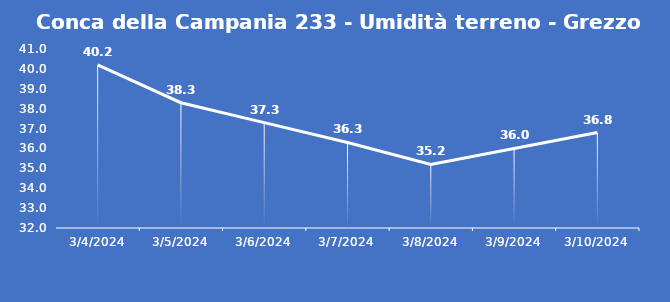
| Category | Conca della Campania 233 - Umidità terreno - Grezzo (%VWC) |
|---|---|
| 3/4/24 | 40.2 |
| 3/5/24 | 38.3 |
| 3/6/24 | 37.3 |
| 3/7/24 | 36.3 |
| 3/8/24 | 35.2 |
| 3/9/24 | 36 |
| 3/10/24 | 36.8 |